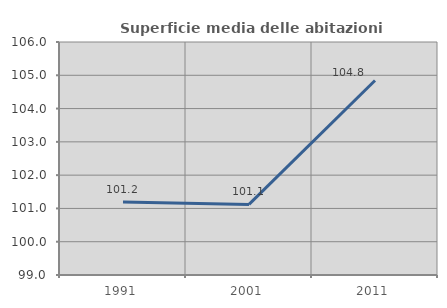
| Category | Superficie media delle abitazioni occupate |
|---|---|
| 1991.0 | 101.195 |
| 2001.0 | 101.12 |
| 2011.0 | 104.845 |